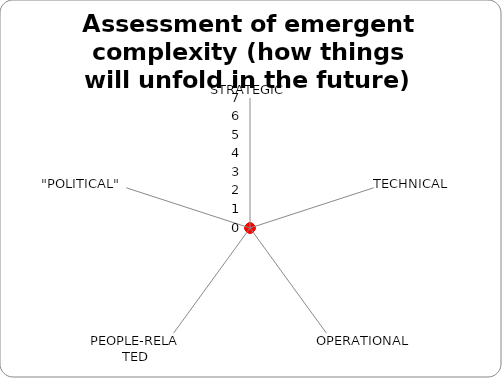
| Category | Complex score |
|---|---|
| STRATEGIC | 0 |
| TECHNICAL | 0 |
| OPERATIONAL | 0 |
| PEOPLE-RELATED | 0 |
| "POLITICAL" | 0 |